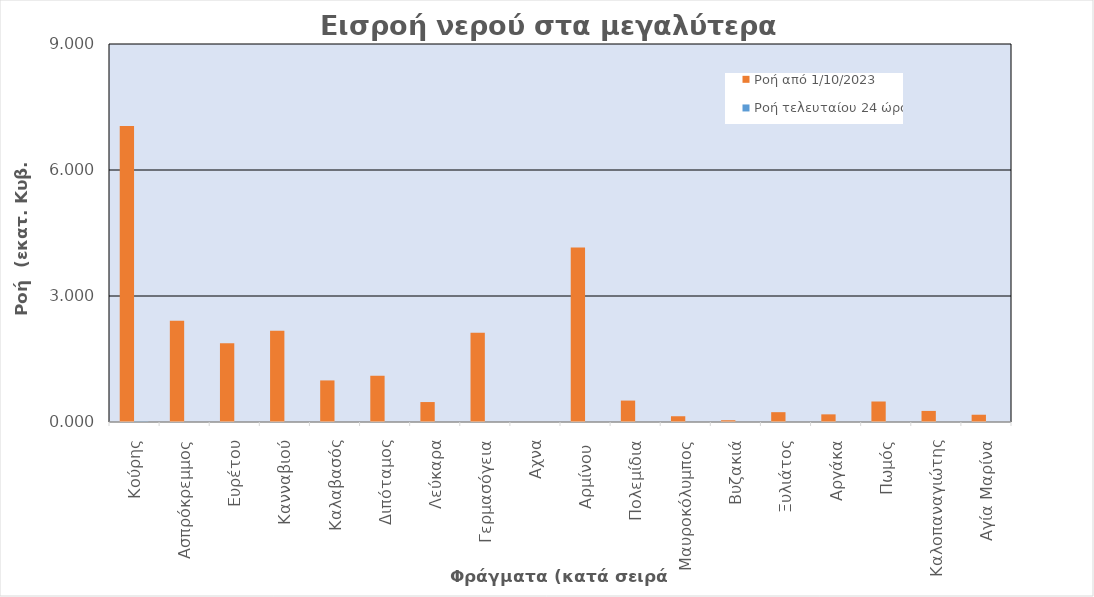
| Category | Ροή από 1/10/2023 | Ροή τελευταίου 24 ώρου |
|---|---|---|
|  Κούρης | 7.046 | 0.011 |
|  Ασπρόκρεμμος | 2.411 | 0 |
|  Ευρέτου | 1.873 | 0 |
|  Κανναβιού | 2.171 | 0 |
|  Καλαβασός | 0.99 | 0 |
|  Διπόταμος | 1.101 | 0 |
|  Λεύκαρα | 0.475 | 0 |
|  Γερμασόγεια | 2.126 | 0 |
|  Αχνα | 0 | 0 |
|  Αρμίνου  | 4.157 | 0 |
|  Πολεμίδια | 0.51 | 0 |
|  Μαυροκόλυμπος | 0.137 | 0 |
|  Βυζακιά | 0.042 | 0 |
|  Ξυλιάτος | 0.234 | 0 |
|  Αργάκα | 0.182 | 0 |
|  Πωμός | 0.488 | 0 |
|  Καλοπαναγιώτης | 0.264 | 0 |
|  Αγία Μαρίνα | 0.173 | 0 |